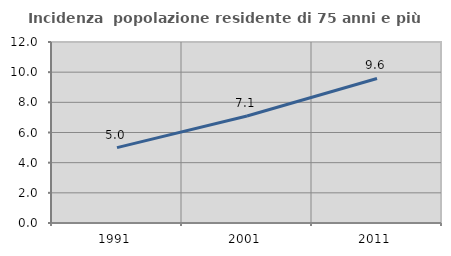
| Category | Incidenza  popolazione residente di 75 anni e più |
|---|---|
| 1991.0 | 5 |
| 2001.0 | 7.091 |
| 2011.0 | 9.584 |